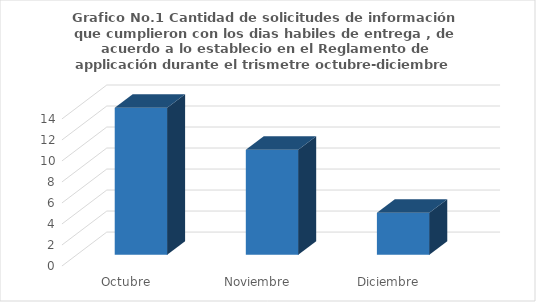
| Category | Series 0 |
|---|---|
| Octubre | 14 |
| Noviembre | 10 |
| Diciembre | 4 |